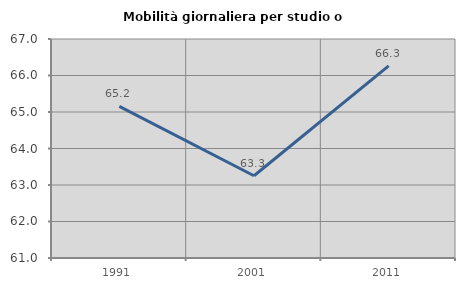
| Category | Mobilità giornaliera per studio o lavoro |
|---|---|
| 1991.0 | 65.155 |
| 2001.0 | 63.254 |
| 2011.0 | 66.265 |